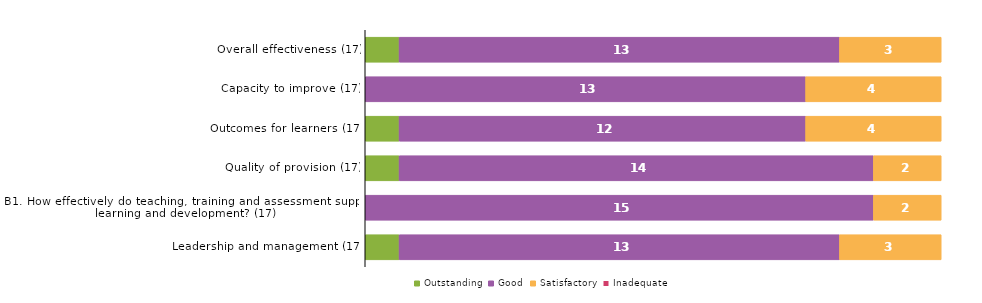
| Category | Outstanding | Good | Satisfactory | Inadequate |
|---|---|---|---|---|
| Overall effectiveness (17) | 1 | 13 | 3 | 0 |
| Capacity to improve (17) | 0 | 13 | 4 | 0 |
| Outcomes for learners (17) | 1 | 12 | 4 | 0 |
| Quality of provision (17) | 1 | 14 | 2 | 0 |
| B1. How effectively do teaching, training and assessment support learning and development? (17) | 0 | 15 | 2 | 0 |
| Leadership and management (17) | 1 | 13 | 3 | 0 |